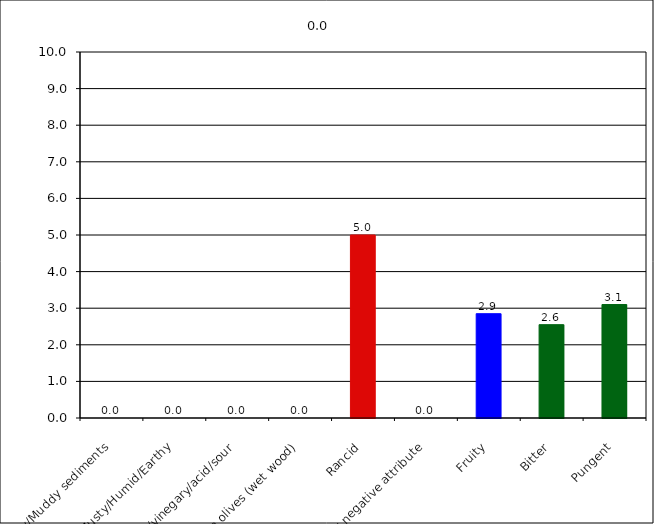
| Category | 0.0 |
|---|---|
| Fusty/Muddy sediments | 0 |
| Musty/Humid/Earthy | 0 |
| Winey/vinegary/acid/sour | 0 |
| Frostbitten olives (wet wood) | 0 |
| Rancid | 5 |
| Other negative attribute | 0 |
| Fruity | 2.85 |
| Bitter | 2.55 |
| Pungent | 3.1 |